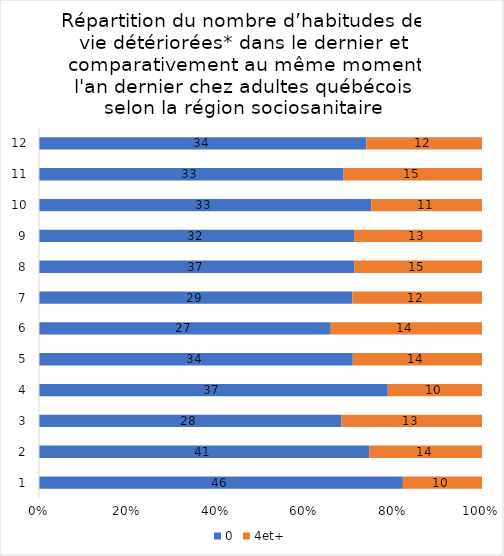
| Category | 0 | 4et+ |
|---|---|---|
| 0 | 46 | 10 |
| 1 | 41 | 14 |
| 2 | 28 | 13 |
| 3 | 37 | 10 |
| 4 | 34 | 14 |
| 5 | 27 | 14 |
| 6 | 29 | 12 |
| 7 | 37 | 15 |
| 8 | 32 | 13 |
| 9 | 33 | 11 |
| 10 | 33 | 15 |
| 11 | 34 | 12 |